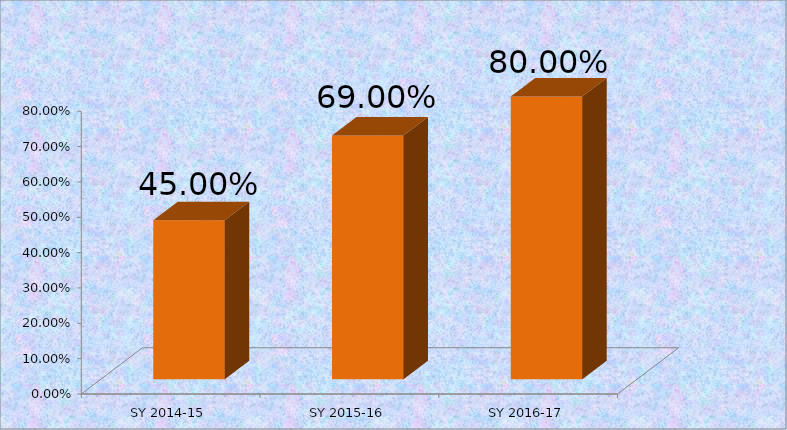
| Category | Series 0 |
|---|---|
| SY 2014-15 | 0.45 |
| SY 2015-16 | 0.69 |
| SY 2016-17 | 0.8 |